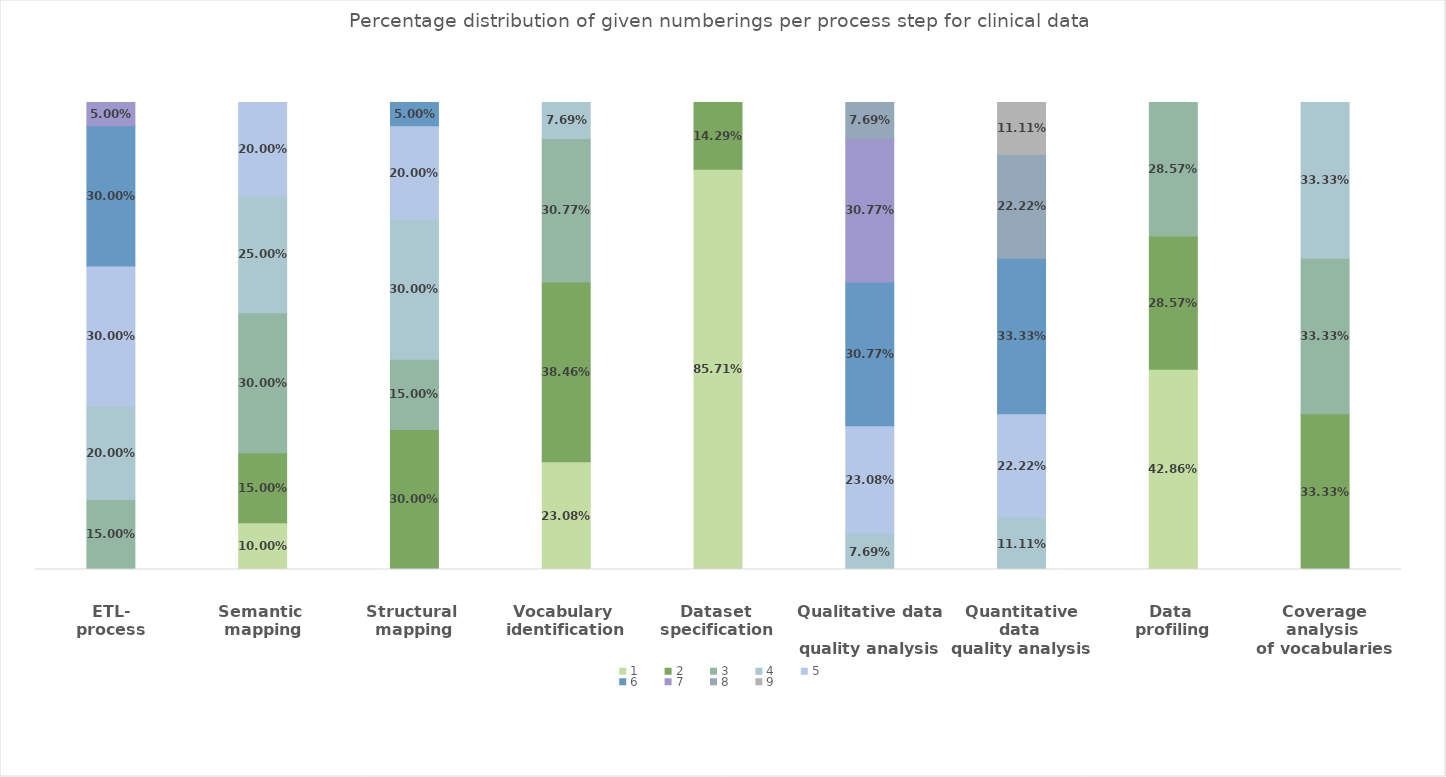
| Category | 1 | 2 | 3 | 4 | 5 | 6 | 7 | 8 | 9 |
|---|---|---|---|---|---|---|---|---|---|
| ETL-
process | 0 | 0 | 0.15 | 0.2 | 0.3 | 0.3 | 0.05 | 0 | 0 |
| Semantic 
mapping | 0.1 | 0.15 | 0.3 | 0.25 | 0.2 | 0 | 0 | 0 | 0 |
| Structural 
mapping | 0 | 0.3 | 0.15 | 0.3 | 0.2 | 0.05 | 0 | 0 | 0 |
| Vocabulary 
identification | 0.231 | 0.385 | 0.308 | 0.077 | 0 | 0 | 0 | 0 | 0 |
| Dataset 
specification | 0.857 | 0.143 | 0 | 0 | 0 | 0 | 0 | 0 | 0 |
| Qualitative data 
quality analysis | 0 | 0 | 0 | 0.077 | 0.231 | 0.308 | 0.308 | 0.077 | 0 |
| Quantitative data 
quality analysis | 0 | 0 | 0 | 0.111 | 0.222 | 0.333 | 0 | 0.222 | 0.111 |
| Data 
profiling | 0.429 | 0.286 | 0.286 | 0 | 0 | 0 | 0 | 0 | 0 |
| Coverage analysis 
of vocabularies | 0 | 0.333 | 0.333 | 0.333 | 0 | 0 | 0 | 0 | 0 |